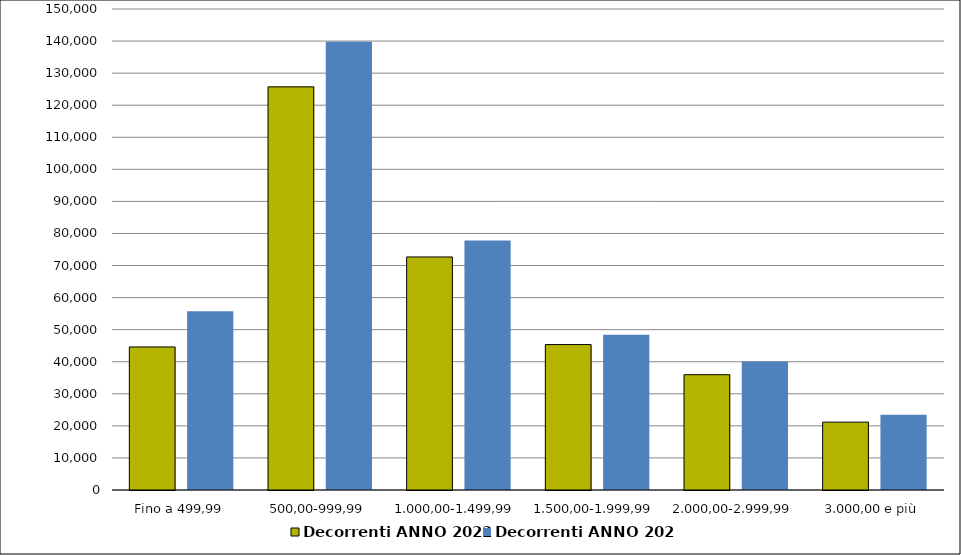
| Category | Decorrenti ANNO 2022 | Decorrenti ANNO 2021 |
|---|---|---|
|  Fino a 499,99  | 44613 | 55709 |
|  500,00-999,99  | 125722 | 139800 |
|  1.000,00-1.499,99  | 72673 | 77840 |
|  1.500,00-1.999,99  | 45345 | 48429 |
|  2.000,00-2.999,99  | 35956 | 40072 |
|  3.000,00 e più  | 21166 | 23466 |